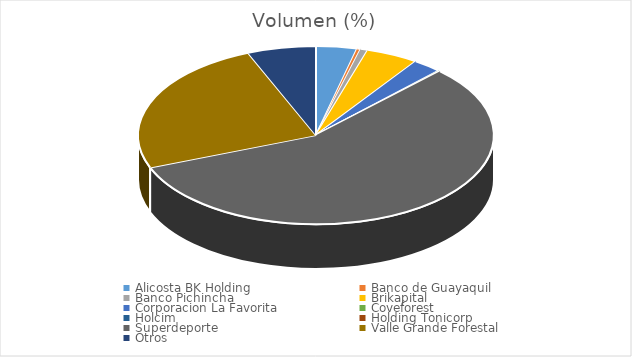
| Category | Volumen |
|---|---|
| Alicosta BK Holding | 169596 |
| Banco de Guayaquil | 14847.5 |
| Banco Pichincha | 30600 |
| Brikapital | 217000 |
| Corporacion La Favorita | 120326.07 |
| Coveforest | 6604 |
| Holcim | 441 |
| Holding Tonicorp | 782.4 |
| Superdeporte | 2590121.53 |
| Valle Grande Forestal | 1125807.8 |
| Otros | 284200 |